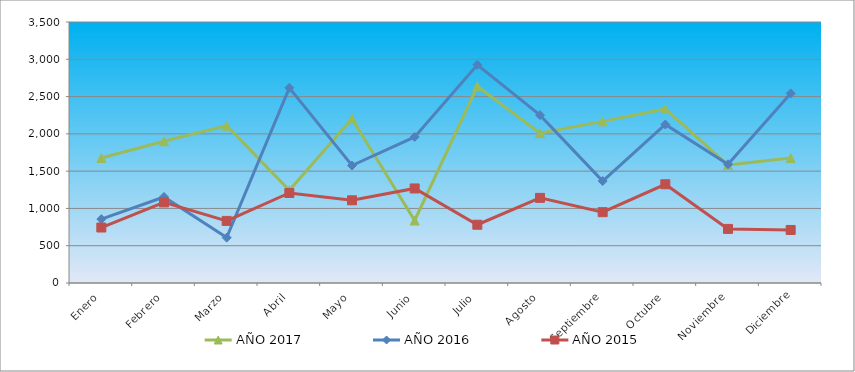
| Category | AÑO 2017 | AÑO 2016 | AÑO 2015 |
|---|---|---|---|
| Enero | 1676.373 | 856.842 | 743.921 |
| Febrero | 1900.371 | 1153.625 | 1080.791 |
| Marzo | 2109.917 | 608.565 | 832.818 |
| Abril | 1242.828 | 2617.663 | 1207.118 |
| Mayo | 2203.852 | 1575.6 | 1108.864 |
| Junio | 838.186 | 1959.079 | 1267.941 |
| Julio | 2637.396 | 2926.114 | 781.351 |
| Agosto | 2008.757 | 2250.857 | 1141.615 |
| Septiembre | 2167.723 | 1367.187 | 949.786 |
| Octubre | 2333.915 | 2125.809 | 1324.086 |
| Noviembre | 1582.438 | 1592.273 | 725.206 |
| Diciembre | 1676.373 | 2542.634 | 711.17 |